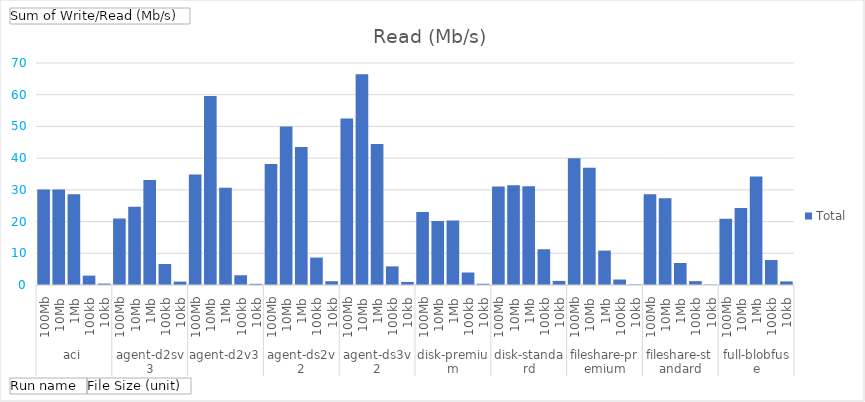
| Category | Total |
|---|---|
| 0 | 30.095 |
| 1 | 30.138 |
| 2 | 28.621 |
| 3 | 2.957 |
| 4 | 0.453 |
| 5 | 20.988 |
| 6 | 24.691 |
| 7 | 33.124 |
| 8 | 6.626 |
| 9 | 1.063 |
| 10 | 34.809 |
| 11 | 59.584 |
| 12 | 30.641 |
| 13 | 3.074 |
| 14 | 0.369 |
| 15 | 38.123 |
| 16 | 49.944 |
| 17 | 43.5 |
| 18 | 8.647 |
| 19 | 1.2 |
| 20 | 52.476 |
| 21 | 66.466 |
| 22 | 44.454 |
| 23 | 5.88 |
| 24 | 0.967 |
| 25 | 23.044 |
| 26 | 20.198 |
| 27 | 20.321 |
| 28 | 3.939 |
| 29 | 0.393 |
| 30 | 31.019 |
| 31 | 31.469 |
| 32 | 31.102 |
| 33 | 11.272 |
| 34 | 1.293 |
| 35 | 39.931 |
| 36 | 36.991 |
| 37 | 10.852 |
| 38 | 1.727 |
| 39 | 0.179 |
| 40 | 28.627 |
| 41 | 27.377 |
| 42 | 6.945 |
| 43 | 1.221 |
| 44 | 0.113 |
| 45 | 20.886 |
| 46 | 24.318 |
| 47 | 34.217 |
| 48 | 7.873 |
| 49 | 1.135 |